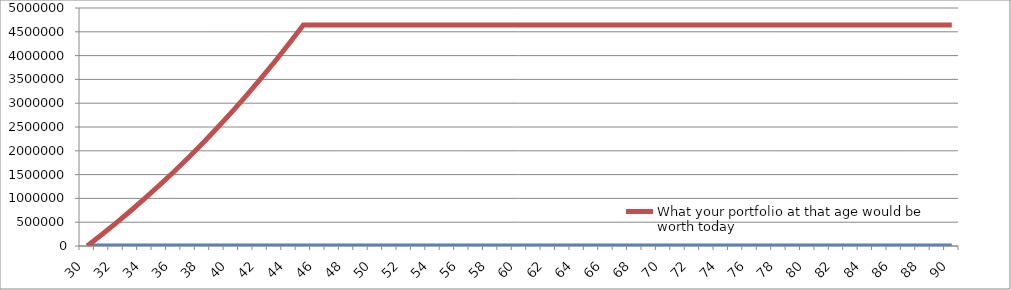
| Category | Age | What your portfolio at that age would be worth today |
|---|---|---|
| 30.0 | 30 | 0 |
| 31.0 | 31 | 235849.057 |
| 32.0 | 32 | 480598.078 |
| 33.0 | 33 | 734582.911 |
| 34.0 | 34 | 998152.077 |
| 35.0 | 35 | 1271667.25 |
| 36.0 | 36 | 1555503.75 |
| 37.0 | 37 | 1850051.061 |
| 38.0 | 38 | 2155713.365 |
| 39.0 | 39 | 2472910.096 |
| 40.0 | 40 | 2802076.515 |
| 41.0 | 41 | 3143664.308 |
| 42.0 | 42 | 3498142.206 |
| 43.0 | 43 | 3865996.629 |
| 44.0 | 44 | 4247732.351 |
| 45.0 | 45 | 4643873.194 |
| 46.0 | 46 | 4643873.194 |
| 47.0 | 47 | 4643873.194 |
| 48.0 | 48 | 4643873.194 |
| 49.0 | 49 | 4643873.194 |
| 50.0 | 50 | 4643873.194 |
| 51.0 | 51 | 4643873.194 |
| 52.0 | 52 | 4643873.194 |
| 53.0 | 53 | 4643873.194 |
| 54.0 | 54 | 4643873.194 |
| 55.0 | 55 | 4643873.194 |
| 56.0 | 56 | 4643873.194 |
| 57.0 | 57 | 4643873.194 |
| 58.0 | 58 | 4643873.194 |
| 59.0 | 59 | 4643873.194 |
| 60.0 | 60 | 4643873.194 |
| 61.0 | 61 | 4643873.194 |
| 62.0 | 62 | 4643873.194 |
| 63.0 | 63 | 4643873.194 |
| 64.0 | 64 | 4643873.194 |
| 65.0 | 65 | 4643873.194 |
| 66.0 | 66 | 4643873.194 |
| 67.0 | 67 | 4643873.194 |
| 68.0 | 68 | 4643873.194 |
| 69.0 | 69 | 4643873.194 |
| 70.0 | 70 | 4643873.194 |
| 71.0 | 71 | 4643873.194 |
| 72.0 | 72 | 4643873.194 |
| 73.0 | 73 | 4643873.194 |
| 74.0 | 74 | 4643873.194 |
| 75.0 | 75 | 4643873.194 |
| 76.0 | 76 | 4643873.194 |
| 77.0 | 77 | 4643873.194 |
| 78.0 | 78 | 4643873.194 |
| 79.0 | 79 | 4643873.194 |
| 80.0 | 80 | 4643873.194 |
| 81.0 | 81 | 4643873.194 |
| 82.0 | 82 | 4643873.194 |
| 83.0 | 83 | 4643873.194 |
| 84.0 | 84 | 4643873.194 |
| 85.0 | 85 | 4643873.194 |
| 86.0 | 86 | 4643873.194 |
| 87.0 | 87 | 4643873.194 |
| 88.0 | 88 | 4643873.194 |
| 89.0 | 89 | 4643873.194 |
| 90.0 | 90 | 4643873.194 |